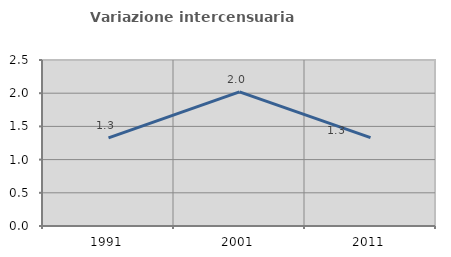
| Category | Variazione intercensuaria annua |
|---|---|
| 1991.0 | 1.326 |
| 2001.0 | 2.021 |
| 2011.0 | 1.332 |